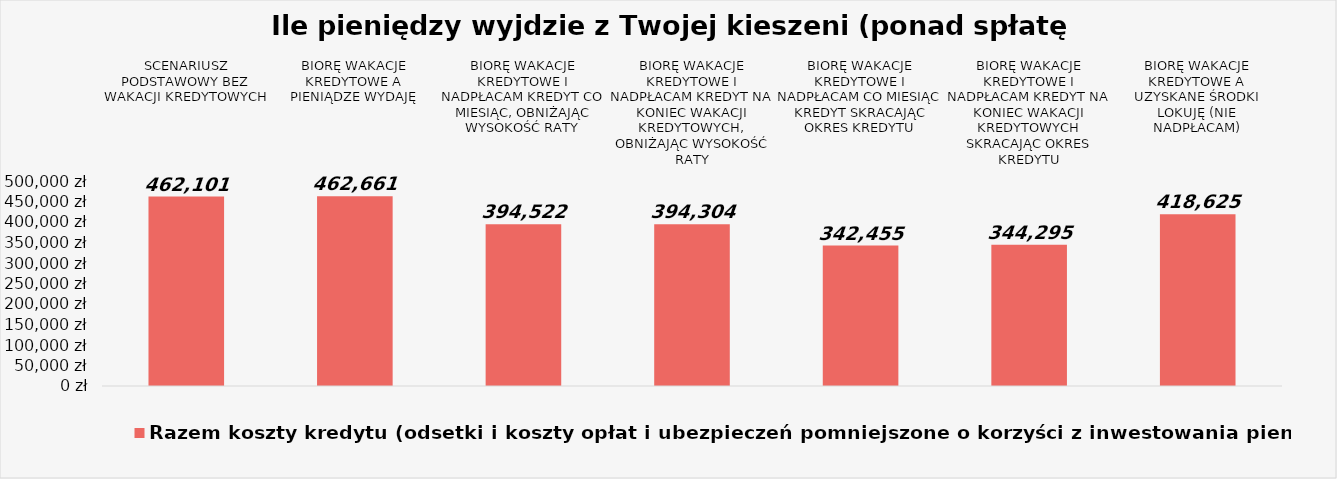
| Category | Razem koszty kredytu (odsetki i koszty opłat i ubezpieczeń pomniejszone o korzyści z inwestowania pieniędzy) |
|---|---|
| SCENARIUSZ PODSTAWOWY BEZ WAKACJI KREDYTOWYCH | 462100.778 |
| BIORĘ WAKACJE KREDYTOWE A PIENIĄDZE WYDAJĘ | 462660.778 |
| BIORĘ WAKACJE KREDYTOWE I NADPŁACAM KREDYT CO MIESIĄC, OBNIŻAJĄC WYSOKOŚĆ RATY | 394522.478 |
| BIORĘ WAKACJE KREDYTOWE I NADPŁACAM KREDYT NA KONIEC WAKACJI KREDYTOWYCH, OBNIŻAJĄC WYSOKOŚĆ RATY | 394303.835 |
| BIORĘ WAKACJE KREDYTOWE I NADPŁACAM CO MIESIĄC KREDYT SKRACAJĄC OKRES KREDYTU | 342454.66 |
| BIORĘ WAKACJE KREDYTOWE I NADPŁACAM KREDYT NA KONIEC WAKACJI KREDYTOWYCH SKRACAJĄC OKRES KREDYTU | 344295.1 |
| BIORĘ WAKACJE KREDYTOWE A UZYSKANE ŚRODKI LOKUJĘ (NIE NADPŁACAM) | 418624.868 |